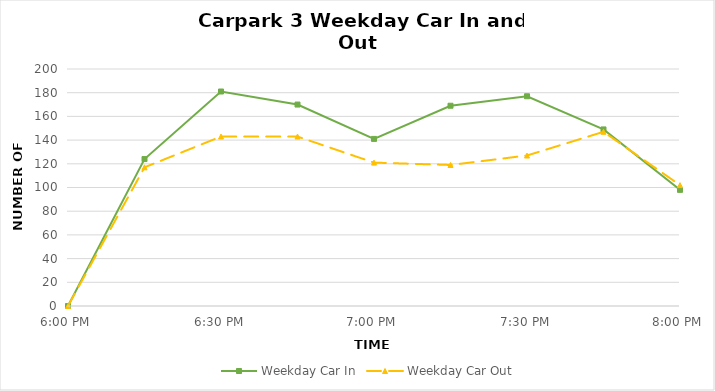
| Category | Weekday Car In | Weekday Car Out |
|---|---|---|
| 0.75 | 0 | 0 |
| 0.760416666666667 | 124 | 117 |
| 0.770833333333333 | 181 | 143 |
| 0.78125 | 170 | 143 |
| 0.791666666666667 | 141 | 121 |
| 0.802083333333333 | 169 | 119 |
| 0.8125 | 177 | 127 |
| 0.822916666666667 | 149 | 147 |
| 0.833333333333333 | 98 | 102 |